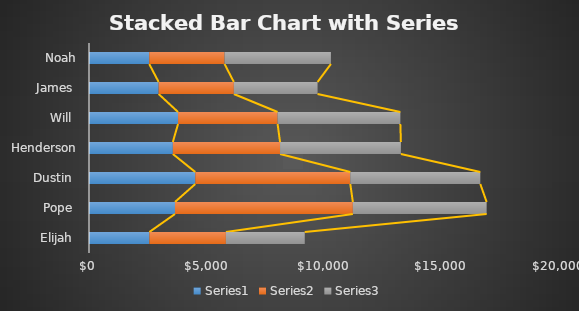
| Category | Series 0 | Series 1 | Series 2 |
|---|---|---|---|
| Elijah  | 2569 | 3256 | 3356 |
| Pope  | 3659 | 7569 | 5693 |
| Dustin  | 4523 | 6596 | 5532 |
| Henderson | 3568 | 4562 | 5142 |
| Will  | 3789 | 4236 | 5224 |
| James  | 2963 | 3201 | 3562 |
| Noah | 2563 | 3205 | 4526 |